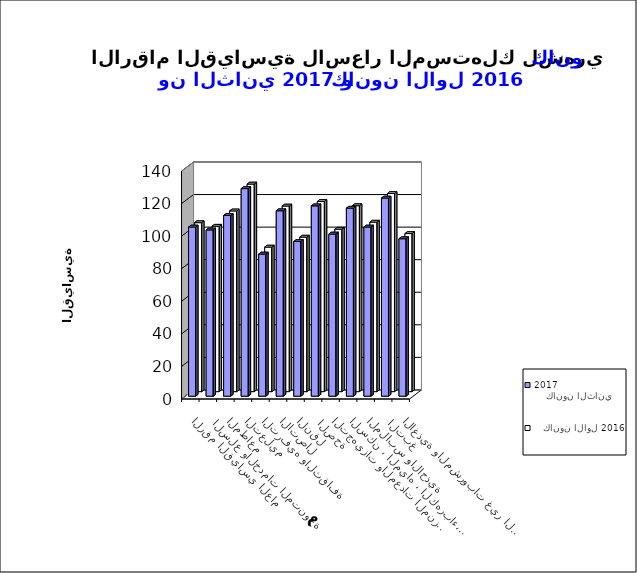
| Category |     كانون الثاني 2017      |    كانون الاول 2016      |
|---|---|---|
| الاغذية والمشروبات غير الكحولية | 96.7 | 97.1 |
|  التبغ | 121.7 | 121.7 |
| الملابس والاحذية | 103.9 | 104.1 |
| السكن ، المياه ، الكهرباء، الغاز  | 115.5 | 114.2 |
| التجهيزات والمعدات المنزلية والصيانة | 99.6 | 99.8 |
|  الصحة | 116.9 | 116.8 |
| النقل | 95 | 94.9 |
| الاتصال | 113.9 | 114 |
| الترفيه والثقافة | 87.3 | 88.8 |
| التعليم | 127.5 | 127.5 |
| المطاعم  | 111 | 111 |
|  السلع والخدمات المتنوعة | 102.1 | 101.6 |
| الرقم القياسي العام | 103.9 | 103.8 |